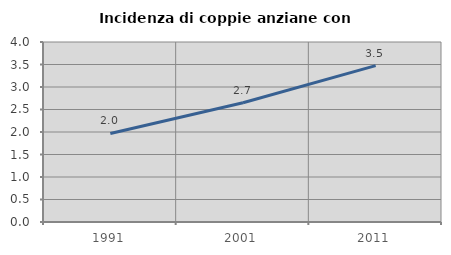
| Category | Incidenza di coppie anziane con figli |
|---|---|
| 1991.0 | 1.967 |
| 2001.0 | 2.651 |
| 2011.0 | 3.474 |